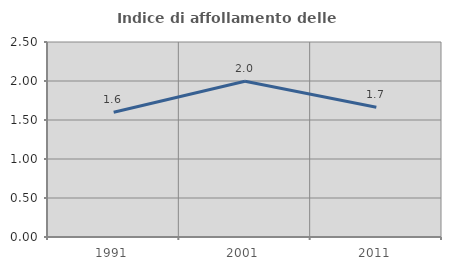
| Category | Indice di affollamento delle abitazioni  |
|---|---|
| 1991.0 | 1.6 |
| 2001.0 | 1.998 |
| 2011.0 | 1.664 |